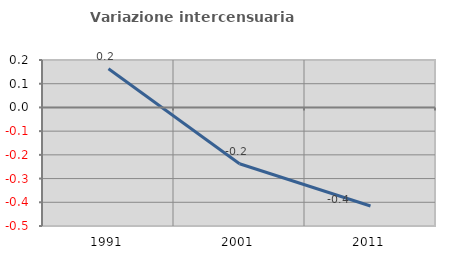
| Category | Variazione intercensuaria annua |
|---|---|
| 1991.0 | 0.163 |
| 2001.0 | -0.237 |
| 2011.0 | -0.416 |